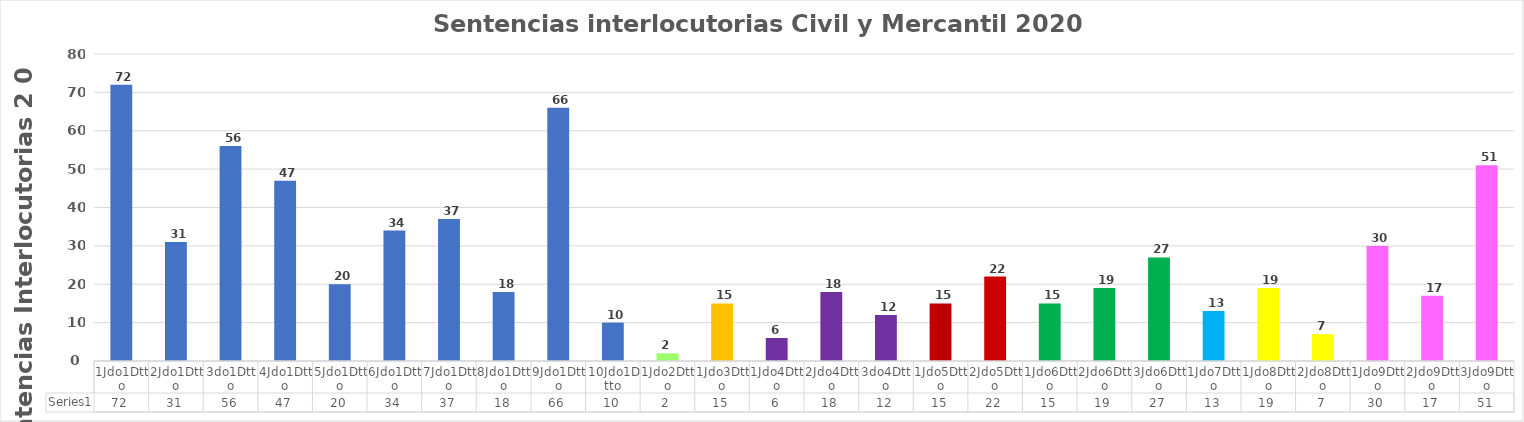
| Category | Series 0 |
|---|---|
| 1Jdo1Dtto | 72 |
| 2Jdo1Dtto | 31 |
| 3do1Dtto | 56 |
| 4Jdo1Dtto | 47 |
| 5Jdo1Dtto | 20 |
| 6Jdo1Dtto | 34 |
| 7Jdo1Dtto | 37 |
| 8Jdo1Dtto | 18 |
| 9Jdo1Dtto | 66 |
| 10Jdo1Dtto | 10 |
| 1Jdo2Dtto | 2 |
| 1Jdo3Dtto | 15 |
| 1Jdo4Dtto | 6 |
| 2Jdo4Dtto | 18 |
| 3do4Dtto | 12 |
| 1Jdo5Dtto | 15 |
| 2Jdo5Dtto | 22 |
| 1Jdo6Dtto | 15 |
| 2Jdo6Dtto | 19 |
| 3Jdo6Dtto | 27 |
| 1Jdo7Dtto | 13 |
| 1Jdo8Dtto | 19 |
| 2Jdo8Dtto | 7 |
| 1Jdo9Dtto | 30 |
| 2Jdo9Dtto | 17 |
| 3Jdo9Dtto | 51 |